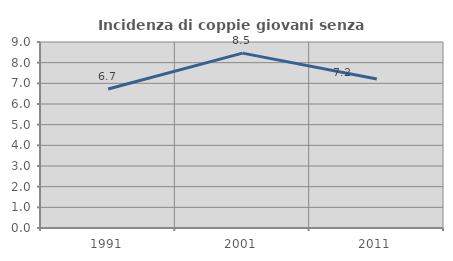
| Category | Incidenza di coppie giovani senza figli |
|---|---|
| 1991.0 | 6.729 |
| 2001.0 | 8.461 |
| 2011.0 | 7.205 |